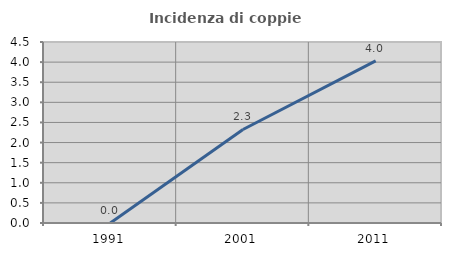
| Category | Incidenza di coppie miste |
|---|---|
| 1991.0 | 0 |
| 2001.0 | 2.326 |
| 2011.0 | 4.032 |